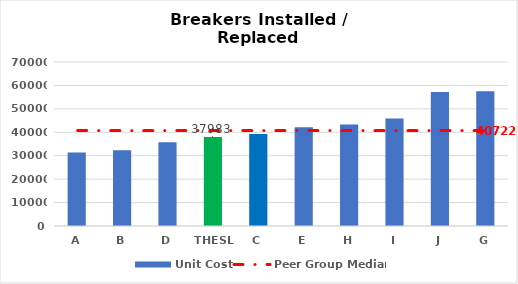
| Category | Unit Cost |
|---|---|
| A | 31406.85 |
| B | 32321.898 |
| D | 35760.996 |
| THESL | 37983 |
| C | 39301.056 |
| E | 42142.05 |
| H | 43285.451 |
| I | 45836.275 |
| J | 57200 |
| G | 57525.5 |